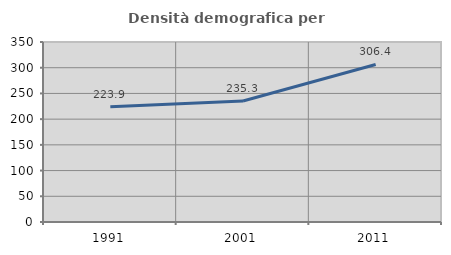
| Category | Densità demografica |
|---|---|
| 1991.0 | 223.889 |
| 2001.0 | 235.296 |
| 2011.0 | 306.367 |